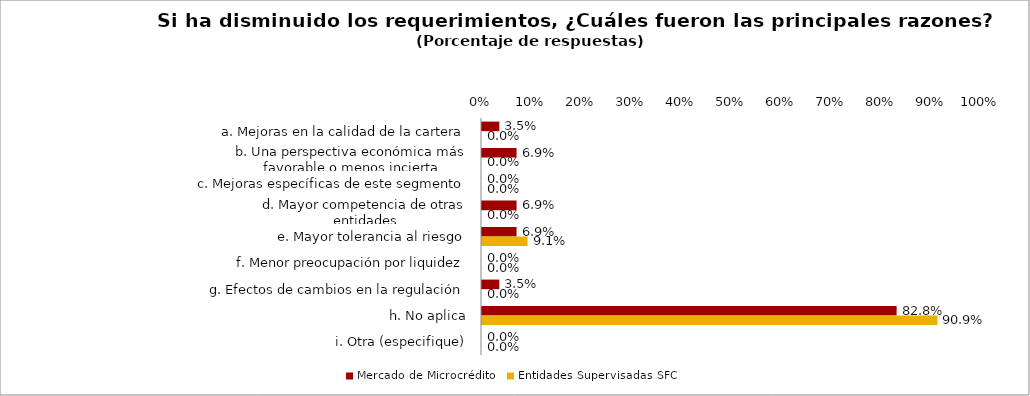
| Category | Mercado de Microcrédito | Entidades Supervisadas SFC |
|---|---|---|
| a. Mejoras en la calidad de la cartera | 0.034 | 0 |
| b. Una perspectiva económica más favorable o menos incierta | 0.069 | 0 |
| c. Mejoras específicas de este segmento | 0 | 0 |
| d. Mayor competencia de otras entidades | 0.069 | 0 |
| e. Mayor tolerancia al riesgo | 0.069 | 0.091 |
| f. Menor preocupación por liquidez | 0 | 0 |
| g. Efectos de cambios en la regulación | 0.034 | 0 |
| h. No aplica | 0.828 | 0.909 |
| i. Otra (especifique) | 0 | 0 |